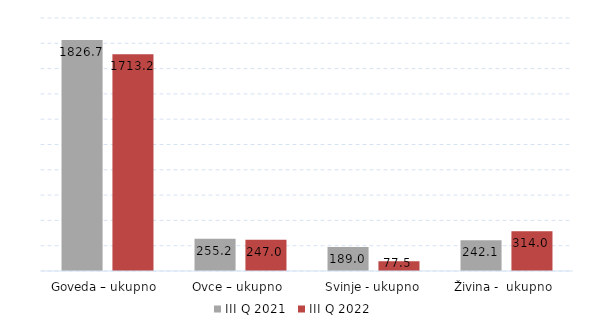
| Category | III Q 2021 | III Q 2022 |
|---|---|---|
| Goveda – ukupno  | 1826.695 | 1713.2 |
| Ovce – ukupno  | 255.2 | 247 |
| Svinje - ukupno | 188.995 | 77.5 |
| Živina -  ukupno  | 242.111 | 314 |